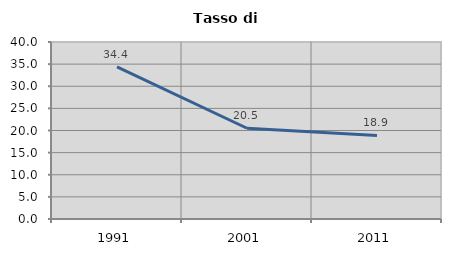
| Category | Tasso di disoccupazione   |
|---|---|
| 1991.0 | 34.385 |
| 2001.0 | 20.51 |
| 2011.0 | 18.882 |